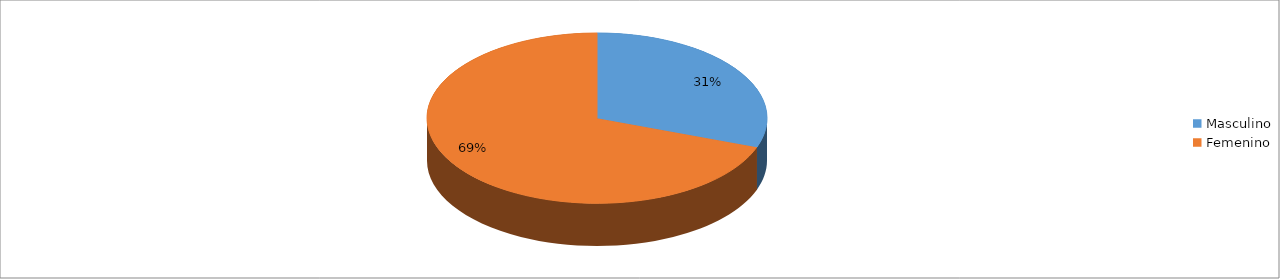
| Category | Series 0 |
|---|---|
| Masculino | 0.306 |
| Femenino | 0.694 |